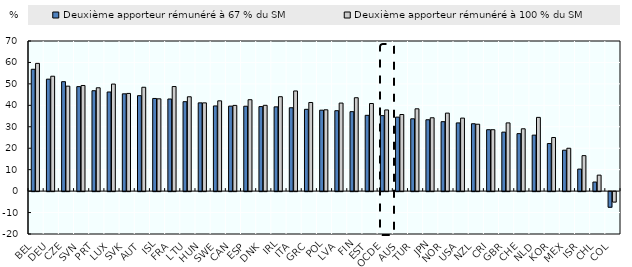
| Category | Deuxième apporteur rémunéré à 67 % du SM | Deuxième apporteur rémunéré à 100 % du SM |
|---|---|---|
| BEL | 56.814 | 59.57 |
| DEU | 52.203 | 53.571 |
| CZE | 51.033 | 48.941 |
| SVN | 48.724 | 49.26 |
| PRT | 46.809 | 48.189 |
| LUX | 46.221 | 49.913 |
| SVK | 45.369 | 45.55 |
| AUT | 44.511 | 48.432 |
| ISL | 43.208 | 43.036 |
| FRA | 42.946 | 48.762 |
| LTU | 41.704 | 43.991 |
| HUN | 41.15 | 41.15 |
| SWE | 39.714 | 42.094 |
| CAN | 39.636 | 39.968 |
| ESP | 39.586 | 42.625 |
| DNK | 39.417 | 40.005 |
| IRL | 39.291 | 44.021 |
| ITA | 38.87 | 46.702 |
| GRC | 38.138 | 41.324 |
| POL | 37.74 | 37.917 |
| LVA | 37.496 | 41.058 |
| FIN | 37.051 | 43.547 |
| EST | 35.341 | 40.848 |
| OCDE | 35.199 | 37.852 |
| AUS | 34.496 | 35.725 |
| TUR | 33.721 | 38.38 |
| JPN | 33.276 | 34.202 |
| NOR | 32.377 | 36.368 |
| USA | 31.803 | 34.044 |
| NZL | 31.417 | 31.187 |
| CRI | 28.633 | 28.633 |
| GBR | 27.505 | 31.808 |
| CHE | 26.8 | 29.066 |
| NLD | 26.101 | 34.381 |
| KOR | 22.182 | 25.005 |
| MEX | 19.083 | 19.98 |
| ISR | 10.267 | 16.543 |
| CHL | 4.228 | 7.449 |
| COL | -7.289 | -4.884 |